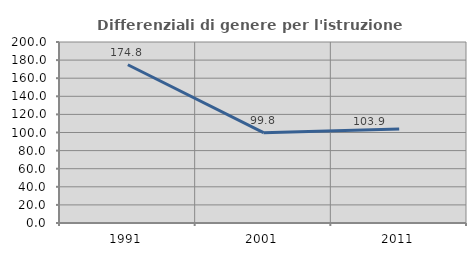
| Category | Differenziali di genere per l'istruzione superiore |
|---|---|
| 1991.0 | 174.825 |
| 2001.0 | 99.815 |
| 2011.0 | 103.947 |